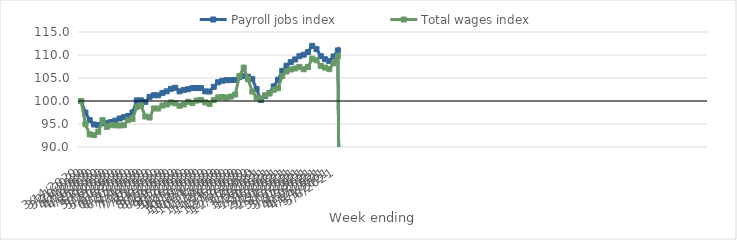
| Category | Payroll jobs index | Total wages index |
|---|---|---|
| 14/03/2020 | 100 | 100 |
| 21/03/2020 | 97.463 | 94.955 |
| 28/03/2020 | 95.834 | 92.732 |
| 04/04/2020 | 94.904 | 92.59 |
| 11/04/2020 | 94.748 | 93.303 |
| 18/04/2020 | 95.146 | 95.832 |
| 25/04/2020 | 95.255 | 94.365 |
| 02/05/2020 | 95.43 | 94.752 |
| 09/05/2020 | 95.739 | 94.71 |
| 16/05/2020 | 96.191 | 94.672 |
| 23/05/2020 | 96.475 | 94.741 |
| 30/05/2020 | 96.757 | 95.89 |
| 06/06/2020 | 97.51 | 96.12 |
| 13/06/2020 | 100.137 | 98.694 |
| 20/06/2020 | 100.135 | 99.01 |
| 27/06/2020 | 99.804 | 96.628 |
| 04/07/2020 | 100.901 | 96.412 |
| 11/07/2020 | 101.258 | 98.377 |
| 18/07/2020 | 101.236 | 98.363 |
| 25/07/2020 | 101.758 | 99.009 |
| 01/08/2020 | 102.109 | 99.248 |
| 08/08/2020 | 102.648 | 99.689 |
| 15/08/2020 | 102.879 | 99.497 |
| 22/08/2020 | 102.092 | 98.941 |
| 29/08/2020 | 102.419 | 99.238 |
| 05/09/2020 | 102.554 | 99.843 |
| 12/09/2020 | 102.806 | 99.591 |
| 19/09/2020 | 102.817 | 100.094 |
| 26/09/2020 | 102.806 | 100.224 |
| 03/10/2020 | 102.088 | 99.702 |
| 10/10/2020 | 102.06 | 99.353 |
| 17/10/2020 | 103.087 | 100.212 |
| 24/10/2020 | 104.075 | 100.78 |
| 31/10/2020 | 104.405 | 100.863 |
| 07/11/2020 | 104.523 | 100.766 |
| 14/11/2020 | 104.548 | 100.976 |
| 21/11/2020 | 104.57 | 101.405 |
| 28/11/2020 | 105.193 | 105.444 |
| 05/12/2020 | 105.479 | 107.249 |
| 12/12/2020 | 105.278 | 104.74 |
| 19/12/2020 | 104.789 | 102.062 |
| 26/12/2020 | 102.577 | 100.788 |
| 02/01/2021 | 100.216 | 100.516 |
| 09/01/2021 | 101.057 | 101.249 |
| 16/01/2021 | 101.73 | 101.629 |
| 23/01/2021 | 103.179 | 102.426 |
| 30/01/2021 | 104.591 | 102.76 |
| 06/02/2021 | 106.52 | 105.437 |
| 13/02/2021 | 107.673 | 106.424 |
| 20/02/2021 | 108.448 | 106.849 |
| 27/02/2021 | 109.035 | 107.071 |
| 06/03/2021 | 109.739 | 107.426 |
| 13/03/2021 | 110.063 | 106.906 |
| 20/03/2021 | 110.621 | 107.378 |
| 27/03/2021 | 111.986 | 109.209 |
| 03/04/2021 | 111.265 | 108.867 |
| 10/04/2021 | 109.748 | 107.641 |
| 17/04/2021 | 109.087 | 107.261 |
| 24/04/2021 | 108.663 | 106.923 |
| 01/05/2021 | 109.674 | 108.2 |
| 08/05/2021 | 110.999 | 109.738 |